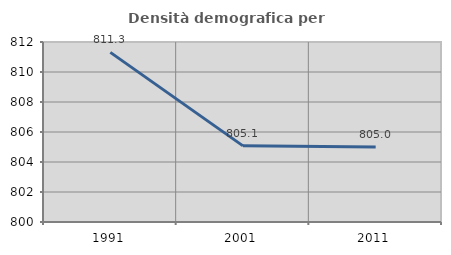
| Category | Densità demografica |
|---|---|
| 1991.0 | 811.308 |
| 2001.0 | 805.076 |
| 2011.0 | 804.996 |